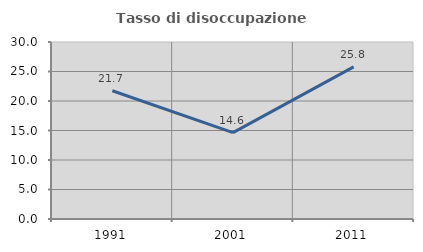
| Category | Tasso di disoccupazione giovanile  |
|---|---|
| 1991.0 | 21.739 |
| 2001.0 | 14.634 |
| 2011.0 | 25.792 |